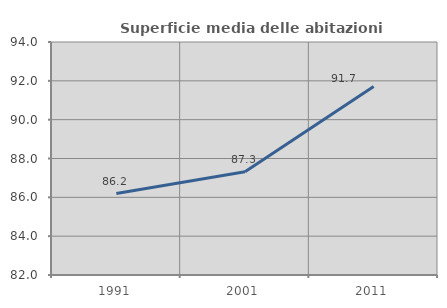
| Category | Superficie media delle abitazioni occupate |
|---|---|
| 1991.0 | 86.194 |
| 2001.0 | 87.321 |
| 2011.0 | 91.714 |